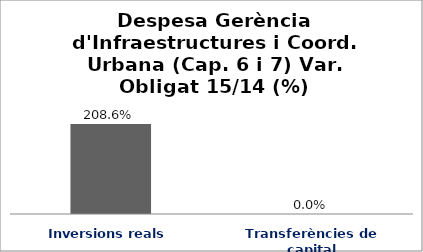
| Category | Series 0 |
|---|---|
| Inversions reals | 2.086 |
| Transferències de capital | 0 |